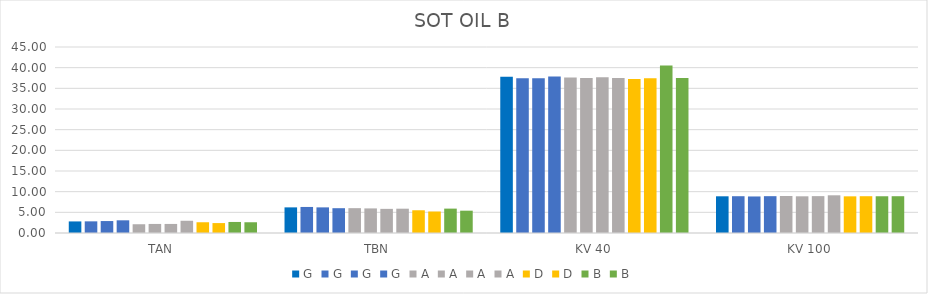
| Category | G | A | D | B |
|---|---|---|---|---|
| TAN | 3.07 | 2.96 | 2.4 | 2.6 |
| TBN | 6 | 5.88 | 5.2 | 5.4 |
| KV 40 | 37.84 | 37.49 | 37.46 | 37.47 |
| KV 100 | 8.91 | 9.12 | 8.9 | 8.9 |